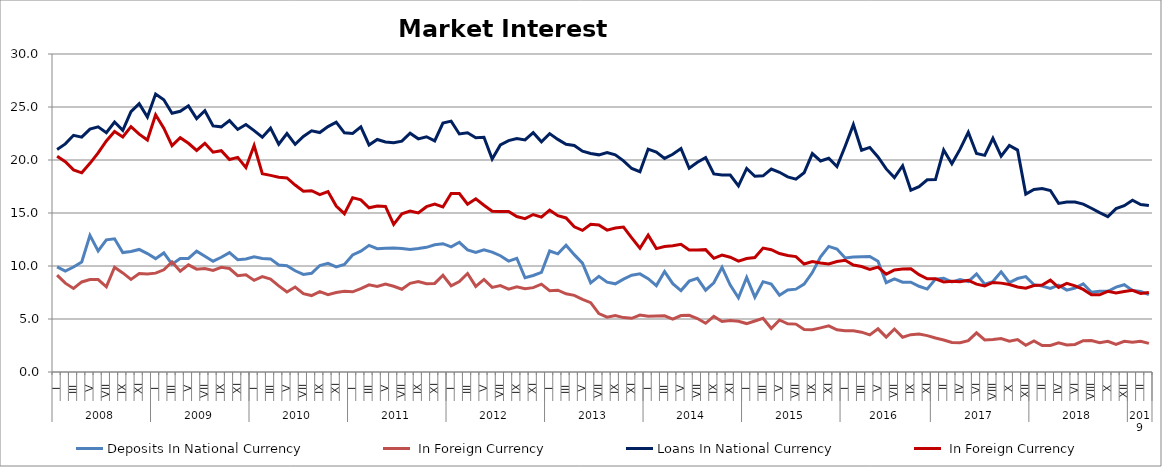
| Category | Deposits | Loans |
|---|---|---|
| 0 | 9.137 | 20.354 |
| 1 | 8.38 | 19.831 |
| 2 | 7.883 | 19.065 |
| 3 | 8.496 | 18.793 |
| 4 | 8.724 | 19.686 |
| 5 | 8.718 | 20.674 |
| 6 | 8.041 | 21.792 |
| 7 | 9.883 | 22.683 |
| 8 | 9.345 | 22.171 |
| 9 | 8.74 | 23.151 |
| 10 | 9.296 | 22.44 |
| 11 | 9.249 | 21.881 |
| 12 | 9.327 | 24.264 |
| 13 | 9.643 | 23.008 |
| 14 | 10.375 | 21.357 |
| 15 | 9.5 | 22.1 |
| 16 | 10.112 | 21.579 |
| 17 | 9.7 | 20.9 |
| 18 | 9.755 | 21.577 |
| 19 | 9.586 | 20.738 |
| 20 | 9.871 | 20.882 |
| 21 | 9.763 | 20.05 |
| 22 | 9.091 | 20.248 |
| 23 | 9.175 | 19.284 |
| 24 | 8.643 | 21.363 |
| 25 | 8.997 | 18.71 |
| 26 | 8.763 | 18.548 |
| 27 | 8.129 | 18.381 |
| 28 | 7.542 | 18.308 |
| 29 | 8.016 | 17.639 |
| 30 | 7.391 | 17.062 |
| 31 | 7.21 | 17.1 |
| 32 | 7.587 | 16.729 |
| 33 | 7.286 | 17.025 |
| 34 | 7.492 | 15.659 |
| 35 | 7.61 | 14.933 |
| 36 | 7.567 | 16.448 |
| 37 | 7.87 | 16.245 |
| 38 | 8.222 | 15.495 |
| 39 | 8.08 | 15.667 |
| 40 | 8.291 | 15.619 |
| 41 | 8.087 | 13.934 |
| 42 | 7.811 | 14.92 |
| 43 | 8.37 | 15.184 |
| 44 | 8.526 | 15.009 |
| 45 | 8.33 | 15.595 |
| 46 | 8.356 | 15.834 |
| 47 | 9.122 | 15.574 |
| 48 | 8.134 | 16.848 |
| 49 | 8.538 | 16.83 |
| 50 | 9.292 | 15.829 |
| 51 | 8.074 | 16.345 |
| 52 | 8.733 | 15.733 |
| 53 | 7.982 | 15.168 |
| 54 | 8.15 | 15.137 |
| 55 | 7.811 | 15.15 |
| 56 | 8.033 | 14.665 |
| 57 | 7.859 | 14.472 |
| 58 | 7.958 | 14.858 |
| 59 | 8.289 | 14.612 |
| 60 | 7.668 | 15.267 |
| 61 | 7.721 | 14.749 |
| 62 | 7.38 | 14.533 |
| 63 | 7.234 | 13.698 |
| 64 | 6.856 | 13.365 |
| 65 | 6.545 | 13.936 |
| 66 | 5.508 | 13.862 |
| 67 | 5.179 | 13.383 |
| 68 | 5.319 | 13.588 |
| 69 | 5.132 | 13.67 |
| 70 | 5.067 | 12.658 |
| 71 | 5.368 | 11.674 |
| 72 | 5.25 | 12.906 |
| 73 | 5.279 | 11.641 |
| 74 | 5.297 | 11.841 |
| 75 | 4.985 | 11.909 |
| 76 | 5.325 | 12.051 |
| 77 | 5.352 | 11.504 |
| 78 | 5.047 | 11.499 |
| 79 | 4.596 | 11.543 |
| 80 | 5.244 | 10.726 |
| 81 | 4.762 | 11.036 |
| 82 | 4.869 | 10.828 |
| 83 | 4.779 | 10.462 |
| 84 | 4.569 | 10.7 |
| 85 | 4.811 | 10.805 |
| 86 | 5.066 | 11.691 |
| 87 | 4.1 | 11.535 |
| 88 | 4.907 | 11.178 |
| 89 | 4.545 | 11 |
| 90 | 4.517 | 10.889 |
| 91 | 4 | 10.188 |
| 92 | 3.981 | 10.416 |
| 93 | 4.164 | 10.276 |
| 94 | 4.358 | 10.188 |
| 95 | 3.977 | 10.418 |
| 96 | 3.892 | 10.543 |
| 97 | 3.89 | 10.092 |
| 98 | 3.757 | 9.946 |
| 99 | 3.505 | 9.677 |
| 100 | 4.071 | 9.899 |
| 101 | 3.296 | 9.237 |
| 102 | 4.052 | 9.631 |
| 103 | 3.28 | 9.709 |
| 104 | 3.523 | 9.747 |
| 105 | 3.578 | 9.18 |
| 106 | 3.431 | 8.793 |
| 107 | 3.202 | 8.797 |
| 108 | 3.022 | 8.494 |
| 109 | 2.785 | 8.558 |
| 110 | 2.769 | 8.517 |
| 111 | 2.953 | 8.646 |
| 112 | 3.69 | 8.286 |
| 113 | 3.022 | 8.114 |
| 114 | 3.063 | 8.452 |
| 115 | 3.156 | 8.385 |
| 116 | 2.9 | 8.257 |
| 117 | 3.057 | 8.025 |
| 118 | 2.522 | 7.91 |
| 119 | 2.938 | 8.164 |
| 120 | 2.492 | 8.208 |
| 121 | 2.51 | 8.664 |
| 122 | 2.75 | 7.978 |
| 123 | 2.556 | 8.364 |
| 124 | 2.597 | 8.133 |
| 125 | 2.959 | 7.791 |
| 126 | 2.968 | 7.284 |
| 127 | 2.764 | 7.278 |
| 128 | 2.898 | 7.604 |
| 129 | 2.611 | 7.462 |
| 130 | 2.891 | 7.598 |
| 131 | 2.8 | 7.7 |
| 132 | 2.9 | 7.4 |
| 133 | 2.7 | 7.5 |